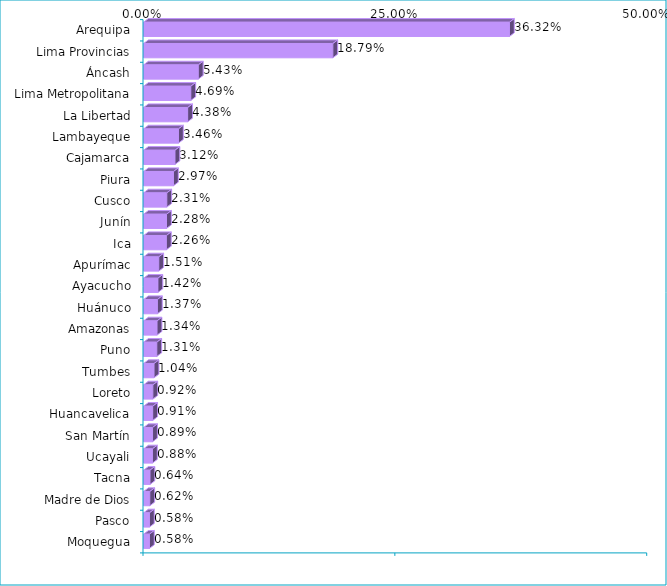
| Category | Series 0 |
|---|---|
| Arequipa | 0.363 |
| Lima Provincias | 0.188 |
| Áncash | 0.054 |
| Lima Metropolitana | 0.047 |
| La Libertad | 0.044 |
| Lambayeque | 0.035 |
| Cajamarca | 0.031 |
| Piura | 0.03 |
| Cusco | 0.023 |
| Junín | 0.023 |
| Ica | 0.023 |
| Apurímac | 0.015 |
| Ayacucho | 0.014 |
| Huánuco | 0.014 |
| Amazonas | 0.013 |
| Puno | 0.013 |
| Tumbes | 0.01 |
| Loreto | 0.009 |
| Huancavelica | 0.009 |
| San Martín | 0.009 |
| Ucayali | 0.009 |
| Tacna | 0.006 |
| Madre de Dios | 0.006 |
| Pasco | 0.006 |
| Moquegua | 0.006 |